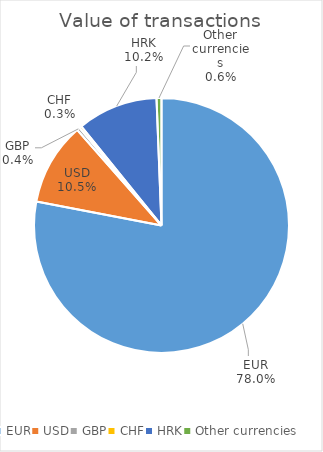
| Category | Value of transactions |
|---|---|
| EUR | 248997866660 |
| USD | 33430072631 |
| GBP | 1283345553 |
| CHF | 913991254 |
| HRK | 32540553874 |
| Other currencies | 1995211754 |